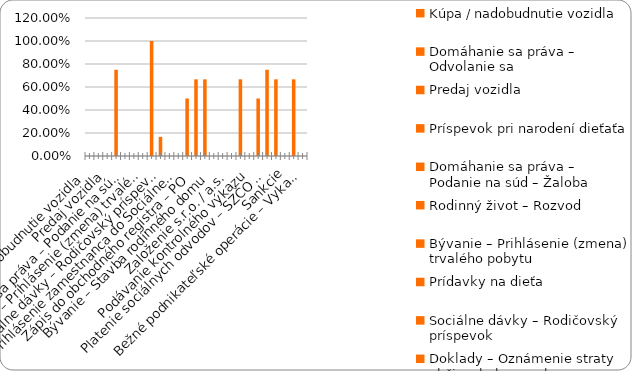
| Category | % |
|---|---|
| Kúpa / nadobudnutie vozidla | 0 |
| Domáhanie sa práva – Odvolanie sa | 0 |
| Predaj vozidla | 0 |
| Príspevok pri narodení dieťaťa | 0.75 |
| Domáhanie sa práva – Podanie na súd – Žaloba | 0 |
| Rodinný život – Rozvod | 0 |
| Bývanie – Prihlásenie (zmena) trvalého pobytu | 0 |
| Prídavky na dieťa | 1 |
| Sociálne dávky – Rodičovský príspevok | 0.167 |
| Doklady – Oznámenie straty občianskeho preukazu | 0 |
| Prihlásenie zamestnanca do Sociálnej poisťovne | 0 |
| Plnenie si daňových povinností – zamestnanec (FO) | 0.5 |
| Zápis do obchodného registra – PO | 0.667 |
| Živnosť - ukončenie | 0.667 |
| Bývanie – Stavba rodinného domu | 0 |
| Sociálne dávky – Príspevok v nezamestnanosti | 0 |
| Založenie s.r.o. / a.s. | 0 |
| Živnosť – založenie | 0.667 |
| Podávanie kontrolného výkazu | 0 |
| Plnenie si daňových povinností – SZČO / PO  | 0.5 |
| Platenie sociálnych odvodov – SZČO / PO | 0.75 |
| Živnosť - prerušenie | 0.667 |
| Sankcie | 0 |
| Živnosť - zmena | 0.667 |
| Bežné podnikateľské operácie – Vykazovanie štatistík | 0 |